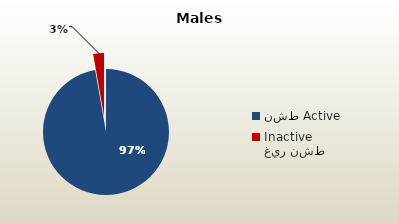
| Category | الذكور غير القطريين  Non-Qatari Males |
|---|---|
| نشط Active | 1661839 |
| غير نشط Inactive | 47161 |